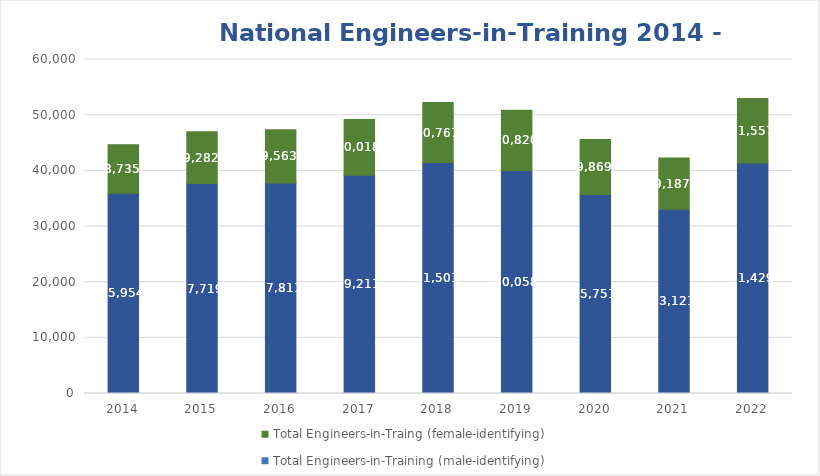
| Category | Total Engineers-in-Training (male-identifying) | Total Engineers-in-Traing (female-identifying) |
|---|---|---|
| 2014.0 | 35954 | 8735 |
| 2015.0 | 37719 | 9282 |
| 2016.0 | 37811 | 9563 |
| 2017.0 | 39211 | 10018 |
| 2018.0 | 41501 | 10767 |
| 2019.0 | 40058 | 10820 |
| 2020.0 | 35751 | 9869 |
| 2021.0 | 33121 | 9187 |
| 2022.0 | 41429 | 11557 |